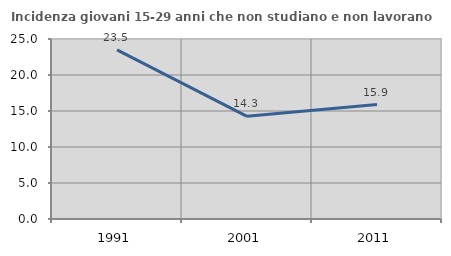
| Category | Incidenza giovani 15-29 anni che non studiano e non lavorano  |
|---|---|
| 1991.0 | 23.484 |
| 2001.0 | 14.259 |
| 2011.0 | 15.9 |